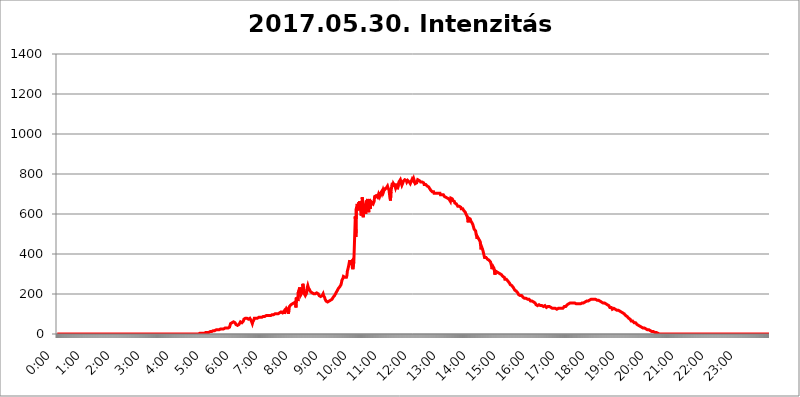
| Category | 2017.05.30. Intenzitás [W/m^2] |
|---|---|
| 0.0 | 0 |
| 0.0006944444444444445 | 0 |
| 0.001388888888888889 | 0 |
| 0.0020833333333333333 | 0 |
| 0.002777777777777778 | 0 |
| 0.003472222222222222 | 0 |
| 0.004166666666666667 | 0 |
| 0.004861111111111111 | 0 |
| 0.005555555555555556 | 0 |
| 0.0062499999999999995 | 0 |
| 0.006944444444444444 | 0 |
| 0.007638888888888889 | 0 |
| 0.008333333333333333 | 0 |
| 0.009027777777777779 | 0 |
| 0.009722222222222222 | 0 |
| 0.010416666666666666 | 0 |
| 0.011111111111111112 | 0 |
| 0.011805555555555555 | 0 |
| 0.012499999999999999 | 0 |
| 0.013194444444444444 | 0 |
| 0.013888888888888888 | 0 |
| 0.014583333333333332 | 0 |
| 0.015277777777777777 | 0 |
| 0.015972222222222224 | 0 |
| 0.016666666666666666 | 0 |
| 0.017361111111111112 | 0 |
| 0.018055555555555557 | 0 |
| 0.01875 | 0 |
| 0.019444444444444445 | 0 |
| 0.02013888888888889 | 0 |
| 0.020833333333333332 | 0 |
| 0.02152777777777778 | 0 |
| 0.022222222222222223 | 0 |
| 0.02291666666666667 | 0 |
| 0.02361111111111111 | 0 |
| 0.024305555555555556 | 0 |
| 0.024999999999999998 | 0 |
| 0.025694444444444447 | 0 |
| 0.02638888888888889 | 0 |
| 0.027083333333333334 | 0 |
| 0.027777777777777776 | 0 |
| 0.02847222222222222 | 0 |
| 0.029166666666666664 | 0 |
| 0.029861111111111113 | 0 |
| 0.030555555555555555 | 0 |
| 0.03125 | 0 |
| 0.03194444444444445 | 0 |
| 0.03263888888888889 | 0 |
| 0.03333333333333333 | 0 |
| 0.034027777777777775 | 0 |
| 0.034722222222222224 | 0 |
| 0.035416666666666666 | 0 |
| 0.036111111111111115 | 0 |
| 0.03680555555555556 | 0 |
| 0.0375 | 0 |
| 0.03819444444444444 | 0 |
| 0.03888888888888889 | 0 |
| 0.03958333333333333 | 0 |
| 0.04027777777777778 | 0 |
| 0.04097222222222222 | 0 |
| 0.041666666666666664 | 0 |
| 0.042361111111111106 | 0 |
| 0.04305555555555556 | 0 |
| 0.043750000000000004 | 0 |
| 0.044444444444444446 | 0 |
| 0.04513888888888889 | 0 |
| 0.04583333333333334 | 0 |
| 0.04652777777777778 | 0 |
| 0.04722222222222222 | 0 |
| 0.04791666666666666 | 0 |
| 0.04861111111111111 | 0 |
| 0.049305555555555554 | 0 |
| 0.049999999999999996 | 0 |
| 0.05069444444444445 | 0 |
| 0.051388888888888894 | 0 |
| 0.052083333333333336 | 0 |
| 0.05277777777777778 | 0 |
| 0.05347222222222222 | 0 |
| 0.05416666666666667 | 0 |
| 0.05486111111111111 | 0 |
| 0.05555555555555555 | 0 |
| 0.05625 | 0 |
| 0.05694444444444444 | 0 |
| 0.057638888888888885 | 0 |
| 0.05833333333333333 | 0 |
| 0.05902777777777778 | 0 |
| 0.059722222222222225 | 0 |
| 0.06041666666666667 | 0 |
| 0.061111111111111116 | 0 |
| 0.06180555555555556 | 0 |
| 0.0625 | 0 |
| 0.06319444444444444 | 0 |
| 0.06388888888888888 | 0 |
| 0.06458333333333334 | 0 |
| 0.06527777777777778 | 0 |
| 0.06597222222222222 | 0 |
| 0.06666666666666667 | 0 |
| 0.06736111111111111 | 0 |
| 0.06805555555555555 | 0 |
| 0.06874999999999999 | 0 |
| 0.06944444444444443 | 0 |
| 0.07013888888888889 | 0 |
| 0.07083333333333333 | 0 |
| 0.07152777777777779 | 0 |
| 0.07222222222222223 | 0 |
| 0.07291666666666667 | 0 |
| 0.07361111111111111 | 0 |
| 0.07430555555555556 | 0 |
| 0.075 | 0 |
| 0.07569444444444444 | 0 |
| 0.0763888888888889 | 0 |
| 0.07708333333333334 | 0 |
| 0.07777777777777778 | 0 |
| 0.07847222222222222 | 0 |
| 0.07916666666666666 | 0 |
| 0.0798611111111111 | 0 |
| 0.08055555555555556 | 0 |
| 0.08125 | 0 |
| 0.08194444444444444 | 0 |
| 0.08263888888888889 | 0 |
| 0.08333333333333333 | 0 |
| 0.08402777777777777 | 0 |
| 0.08472222222222221 | 0 |
| 0.08541666666666665 | 0 |
| 0.08611111111111112 | 0 |
| 0.08680555555555557 | 0 |
| 0.08750000000000001 | 0 |
| 0.08819444444444445 | 0 |
| 0.08888888888888889 | 0 |
| 0.08958333333333333 | 0 |
| 0.09027777777777778 | 0 |
| 0.09097222222222222 | 0 |
| 0.09166666666666667 | 0 |
| 0.09236111111111112 | 0 |
| 0.09305555555555556 | 0 |
| 0.09375 | 0 |
| 0.09444444444444444 | 0 |
| 0.09513888888888888 | 0 |
| 0.09583333333333333 | 0 |
| 0.09652777777777777 | 0 |
| 0.09722222222222222 | 0 |
| 0.09791666666666667 | 0 |
| 0.09861111111111111 | 0 |
| 0.09930555555555555 | 0 |
| 0.09999999999999999 | 0 |
| 0.10069444444444443 | 0 |
| 0.1013888888888889 | 0 |
| 0.10208333333333335 | 0 |
| 0.10277777777777779 | 0 |
| 0.10347222222222223 | 0 |
| 0.10416666666666667 | 0 |
| 0.10486111111111111 | 0 |
| 0.10555555555555556 | 0 |
| 0.10625 | 0 |
| 0.10694444444444444 | 0 |
| 0.1076388888888889 | 0 |
| 0.10833333333333334 | 0 |
| 0.10902777777777778 | 0 |
| 0.10972222222222222 | 0 |
| 0.1111111111111111 | 0 |
| 0.11180555555555556 | 0 |
| 0.11180555555555556 | 0 |
| 0.1125 | 0 |
| 0.11319444444444444 | 0 |
| 0.11388888888888889 | 0 |
| 0.11458333333333333 | 0 |
| 0.11527777777777777 | 0 |
| 0.11597222222222221 | 0 |
| 0.11666666666666665 | 0 |
| 0.1173611111111111 | 0 |
| 0.11805555555555557 | 0 |
| 0.11944444444444445 | 0 |
| 0.12013888888888889 | 0 |
| 0.12083333333333333 | 0 |
| 0.12152777777777778 | 0 |
| 0.12222222222222223 | 0 |
| 0.12291666666666667 | 0 |
| 0.12291666666666667 | 0 |
| 0.12361111111111112 | 0 |
| 0.12430555555555556 | 0 |
| 0.125 | 0 |
| 0.12569444444444444 | 0 |
| 0.12638888888888888 | 0 |
| 0.12708333333333333 | 0 |
| 0.16875 | 0 |
| 0.12847222222222224 | 0 |
| 0.12916666666666668 | 0 |
| 0.12986111111111112 | 0 |
| 0.13055555555555556 | 0 |
| 0.13125 | 0 |
| 0.13194444444444445 | 0 |
| 0.1326388888888889 | 0 |
| 0.13333333333333333 | 0 |
| 0.13402777777777777 | 0 |
| 0.13402777777777777 | 0 |
| 0.13472222222222222 | 0 |
| 0.13541666666666666 | 0 |
| 0.1361111111111111 | 0 |
| 0.13749999999999998 | 0 |
| 0.13819444444444443 | 0 |
| 0.1388888888888889 | 0 |
| 0.13958333333333334 | 0 |
| 0.14027777777777778 | 0 |
| 0.14097222222222222 | 0 |
| 0.14166666666666666 | 0 |
| 0.1423611111111111 | 0 |
| 0.14305555555555557 | 0 |
| 0.14375000000000002 | 0 |
| 0.14444444444444446 | 0 |
| 0.1451388888888889 | 0 |
| 0.1451388888888889 | 0 |
| 0.14652777777777778 | 0 |
| 0.14722222222222223 | 0 |
| 0.14791666666666667 | 0 |
| 0.1486111111111111 | 0 |
| 0.14930555555555555 | 0 |
| 0.15 | 0 |
| 0.15069444444444444 | 0 |
| 0.15138888888888888 | 0 |
| 0.15208333333333332 | 0 |
| 0.15277777777777776 | 0 |
| 0.15347222222222223 | 0 |
| 0.15416666666666667 | 0 |
| 0.15486111111111112 | 0 |
| 0.15555555555555556 | 0 |
| 0.15625 | 0 |
| 0.15694444444444444 | 0 |
| 0.15763888888888888 | 0 |
| 0.15833333333333333 | 0 |
| 0.15902777777777777 | 0 |
| 0.15972222222222224 | 0 |
| 0.16041666666666668 | 0 |
| 0.16111111111111112 | 0 |
| 0.16180555555555556 | 0 |
| 0.1625 | 0 |
| 0.16319444444444445 | 0 |
| 0.1638888888888889 | 0 |
| 0.16458333333333333 | 0 |
| 0.16527777777777777 | 0 |
| 0.16597222222222222 | 0 |
| 0.16666666666666666 | 0 |
| 0.1673611111111111 | 0 |
| 0.16805555555555554 | 0 |
| 0.16874999999999998 | 0 |
| 0.16944444444444443 | 0 |
| 0.17013888888888887 | 0 |
| 0.1708333333333333 | 0 |
| 0.17152777777777775 | 0 |
| 0.17222222222222225 | 0 |
| 0.1729166666666667 | 0 |
| 0.17361111111111113 | 0 |
| 0.17430555555555557 | 0 |
| 0.17500000000000002 | 0 |
| 0.17569444444444446 | 0 |
| 0.1763888888888889 | 0 |
| 0.17708333333333334 | 0 |
| 0.17777777777777778 | 0 |
| 0.17847222222222223 | 0 |
| 0.17916666666666667 | 0 |
| 0.1798611111111111 | 0 |
| 0.18055555555555555 | 0 |
| 0.18125 | 0 |
| 0.18194444444444444 | 0 |
| 0.1826388888888889 | 0 |
| 0.18333333333333335 | 0 |
| 0.1840277777777778 | 0 |
| 0.18472222222222223 | 0 |
| 0.18541666666666667 | 0 |
| 0.18611111111111112 | 0 |
| 0.18680555555555556 | 0 |
| 0.1875 | 0 |
| 0.18819444444444444 | 0 |
| 0.18888888888888888 | 0 |
| 0.18958333333333333 | 0 |
| 0.19027777777777777 | 0 |
| 0.1909722222222222 | 0 |
| 0.19166666666666665 | 0 |
| 0.19236111111111112 | 0 |
| 0.19305555555555554 | 0 |
| 0.19375 | 0 |
| 0.19444444444444445 | 0 |
| 0.1951388888888889 | 0 |
| 0.19583333333333333 | 0 |
| 0.19652777777777777 | 0 |
| 0.19722222222222222 | 0 |
| 0.19791666666666666 | 0 |
| 0.1986111111111111 | 0 |
| 0.19930555555555554 | 3.525 |
| 0.19999999999999998 | 3.525 |
| 0.20069444444444443 | 3.525 |
| 0.20138888888888887 | 3.525 |
| 0.2020833333333333 | 3.525 |
| 0.2027777777777778 | 3.525 |
| 0.2034722222222222 | 3.525 |
| 0.2041666666666667 | 3.525 |
| 0.20486111111111113 | 3.525 |
| 0.20555555555555557 | 3.525 |
| 0.20625000000000002 | 3.525 |
| 0.20694444444444446 | 3.525 |
| 0.2076388888888889 | 3.525 |
| 0.20833333333333334 | 7.887 |
| 0.20902777777777778 | 7.887 |
| 0.20972222222222223 | 7.887 |
| 0.21041666666666667 | 7.887 |
| 0.2111111111111111 | 7.887 |
| 0.21180555555555555 | 7.887 |
| 0.2125 | 7.887 |
| 0.21319444444444444 | 7.887 |
| 0.2138888888888889 | 12.257 |
| 0.21458333333333335 | 12.257 |
| 0.2152777777777778 | 12.257 |
| 0.21597222222222223 | 12.257 |
| 0.21666666666666667 | 12.257 |
| 0.21736111111111112 | 12.257 |
| 0.21805555555555556 | 12.257 |
| 0.21875 | 16.636 |
| 0.21944444444444444 | 16.636 |
| 0.22013888888888888 | 16.636 |
| 0.22083333333333333 | 16.636 |
| 0.22152777777777777 | 16.636 |
| 0.2222222222222222 | 16.636 |
| 0.22291666666666665 | 21.024 |
| 0.2236111111111111 | 21.024 |
| 0.22430555555555556 | 21.024 |
| 0.225 | 21.024 |
| 0.22569444444444445 | 21.024 |
| 0.2263888888888889 | 21.024 |
| 0.22708333333333333 | 21.024 |
| 0.22777777777777777 | 21.024 |
| 0.22847222222222222 | 25.419 |
| 0.22916666666666666 | 25.419 |
| 0.2298611111111111 | 25.419 |
| 0.23055555555555554 | 25.419 |
| 0.23124999999999998 | 25.419 |
| 0.23194444444444443 | 25.419 |
| 0.23263888888888887 | 25.419 |
| 0.2333333333333333 | 25.419 |
| 0.2340277777777778 | 25.419 |
| 0.2347222222222222 | 29.823 |
| 0.2354166666666667 | 29.823 |
| 0.23611111111111113 | 29.823 |
| 0.23680555555555557 | 29.823 |
| 0.23750000000000002 | 29.823 |
| 0.23819444444444446 | 29.823 |
| 0.2388888888888889 | 29.823 |
| 0.23958333333333334 | 29.823 |
| 0.24027777777777778 | 34.234 |
| 0.24097222222222223 | 34.234 |
| 0.24166666666666667 | 34.234 |
| 0.2423611111111111 | 38.653 |
| 0.24305555555555555 | 51.951 |
| 0.24375 | 51.951 |
| 0.24444444444444446 | 56.398 |
| 0.24513888888888888 | 56.398 |
| 0.24583333333333335 | 56.398 |
| 0.2465277777777778 | 60.85 |
| 0.24722222222222223 | 60.85 |
| 0.24791666666666667 | 60.85 |
| 0.24861111111111112 | 60.85 |
| 0.24930555555555556 | 56.398 |
| 0.25 | 56.398 |
| 0.25069444444444444 | 47.511 |
| 0.2513888888888889 | 43.079 |
| 0.2520833333333333 | 43.079 |
| 0.25277777777777777 | 43.079 |
| 0.2534722222222222 | 43.079 |
| 0.25416666666666665 | 47.511 |
| 0.2548611111111111 | 47.511 |
| 0.2555555555555556 | 47.511 |
| 0.25625000000000003 | 51.951 |
| 0.2569444444444445 | 60.85 |
| 0.2576388888888889 | 65.31 |
| 0.25833333333333336 | 65.31 |
| 0.2590277777777778 | 56.398 |
| 0.25972222222222224 | 60.85 |
| 0.2604166666666667 | 60.85 |
| 0.2611111111111111 | 65.31 |
| 0.26180555555555557 | 74.246 |
| 0.2625 | 78.722 |
| 0.26319444444444445 | 74.246 |
| 0.2638888888888889 | 78.722 |
| 0.26458333333333334 | 78.722 |
| 0.2652777777777778 | 78.722 |
| 0.2659722222222222 | 78.722 |
| 0.26666666666666666 | 78.722 |
| 0.2673611111111111 | 74.246 |
| 0.26805555555555555 | 74.246 |
| 0.26875 | 78.722 |
| 0.26944444444444443 | 78.722 |
| 0.2701388888888889 | 78.722 |
| 0.2708333333333333 | 78.722 |
| 0.27152777777777776 | 78.722 |
| 0.2722222222222222 | 65.31 |
| 0.27291666666666664 | 60.85 |
| 0.2736111111111111 | 51.951 |
| 0.2743055555555555 | 60.85 |
| 0.27499999999999997 | 60.85 |
| 0.27569444444444446 | 69.775 |
| 0.27638888888888885 | 78.722 |
| 0.27708333333333335 | 78.722 |
| 0.2777777777777778 | 78.722 |
| 0.27847222222222223 | 78.722 |
| 0.2791666666666667 | 78.722 |
| 0.2798611111111111 | 74.246 |
| 0.28055555555555556 | 78.722 |
| 0.28125 | 78.722 |
| 0.28194444444444444 | 83.205 |
| 0.2826388888888889 | 83.205 |
| 0.2833333333333333 | 83.205 |
| 0.28402777777777777 | 83.205 |
| 0.2847222222222222 | 83.205 |
| 0.28541666666666665 | 83.205 |
| 0.28611111111111115 | 83.205 |
| 0.28680555555555554 | 83.205 |
| 0.28750000000000003 | 83.205 |
| 0.2881944444444445 | 87.692 |
| 0.2888888888888889 | 87.692 |
| 0.28958333333333336 | 87.692 |
| 0.2902777777777778 | 87.692 |
| 0.29097222222222224 | 87.692 |
| 0.2916666666666667 | 87.692 |
| 0.2923611111111111 | 87.692 |
| 0.29305555555555557 | 92.184 |
| 0.29375 | 92.184 |
| 0.29444444444444445 | 92.184 |
| 0.2951388888888889 | 92.184 |
| 0.29583333333333334 | 92.184 |
| 0.2965277777777778 | 92.184 |
| 0.2972222222222222 | 92.184 |
| 0.29791666666666666 | 92.184 |
| 0.2986111111111111 | 92.184 |
| 0.29930555555555555 | 92.184 |
| 0.3 | 96.682 |
| 0.30069444444444443 | 96.682 |
| 0.3013888888888889 | 96.682 |
| 0.3020833333333333 | 96.682 |
| 0.30277777777777776 | 96.682 |
| 0.3034722222222222 | 96.682 |
| 0.30416666666666664 | 101.184 |
| 0.3048611111111111 | 101.184 |
| 0.3055555555555555 | 101.184 |
| 0.30624999999999997 | 101.184 |
| 0.3069444444444444 | 101.184 |
| 0.3076388888888889 | 101.184 |
| 0.30833333333333335 | 101.184 |
| 0.3090277777777778 | 101.184 |
| 0.30972222222222223 | 101.184 |
| 0.3104166666666667 | 105.69 |
| 0.3111111111111111 | 105.69 |
| 0.31180555555555556 | 105.69 |
| 0.3125 | 105.69 |
| 0.31319444444444444 | 105.69 |
| 0.3138888888888889 | 110.201 |
| 0.3145833333333333 | 110.201 |
| 0.31527777777777777 | 110.201 |
| 0.3159722222222222 | 105.69 |
| 0.31666666666666665 | 110.201 |
| 0.31736111111111115 | 110.201 |
| 0.31805555555555554 | 114.716 |
| 0.31875000000000003 | 101.184 |
| 0.3194444444444445 | 110.201 |
| 0.3201388888888889 | 114.716 |
| 0.32083333333333336 | 105.69 |
| 0.3215277777777778 | 128.284 |
| 0.32222222222222224 | 128.284 |
| 0.3229166666666667 | 128.284 |
| 0.3236111111111111 | 119.235 |
| 0.32430555555555557 | 101.184 |
| 0.325 | 128.284 |
| 0.32569444444444445 | 137.347 |
| 0.3263888888888889 | 137.347 |
| 0.32708333333333334 | 141.884 |
| 0.3277777777777778 | 146.423 |
| 0.3284722222222222 | 146.423 |
| 0.32916666666666666 | 150.964 |
| 0.3298611111111111 | 150.964 |
| 0.33055555555555555 | 155.509 |
| 0.33125 | 155.509 |
| 0.33194444444444443 | 155.509 |
| 0.3326388888888889 | 160.056 |
| 0.3333333333333333 | 160.056 |
| 0.3340277777777778 | 160.056 |
| 0.3347222222222222 | 132.814 |
| 0.3354166666666667 | 182.82 |
| 0.3361111111111111 | 182.82 |
| 0.3368055555555556 | 182.82 |
| 0.33749999999999997 | 164.605 |
| 0.33819444444444446 | 210.182 |
| 0.33888888888888885 | 219.309 |
| 0.33958333333333335 | 223.873 |
| 0.34027777777777773 | 233 |
| 0.34097222222222223 | 214.746 |
| 0.3416666666666666 | 196.497 |
| 0.3423611111111111 | 191.937 |
| 0.3430555555555555 | 196.497 |
| 0.34375 | 210.182 |
| 0.3444444444444445 | 251.251 |
| 0.3451388888888889 | 255.813 |
| 0.3458333333333334 | 219.309 |
| 0.34652777777777777 | 201.058 |
| 0.34722222222222227 | 196.497 |
| 0.34791666666666665 | 191.937 |
| 0.34861111111111115 | 196.497 |
| 0.34930555555555554 | 201.058 |
| 0.35000000000000003 | 210.182 |
| 0.3506944444444444 | 233 |
| 0.3513888888888889 | 242.127 |
| 0.3520833333333333 | 233 |
| 0.3527777777777778 | 228.436 |
| 0.3534722222222222 | 228.436 |
| 0.3541666666666667 | 219.309 |
| 0.3548611111111111 | 214.746 |
| 0.35555555555555557 | 210.182 |
| 0.35625 | 205.62 |
| 0.35694444444444445 | 205.62 |
| 0.3576388888888889 | 205.62 |
| 0.35833333333333334 | 205.62 |
| 0.3590277777777778 | 201.058 |
| 0.3597222222222222 | 201.058 |
| 0.36041666666666666 | 201.058 |
| 0.3611111111111111 | 201.058 |
| 0.36180555555555555 | 201.058 |
| 0.3625 | 201.058 |
| 0.36319444444444443 | 205.62 |
| 0.3638888888888889 | 205.62 |
| 0.3645833333333333 | 205.62 |
| 0.3652777777777778 | 205.62 |
| 0.3659722222222222 | 201.058 |
| 0.3666666666666667 | 196.497 |
| 0.3673611111111111 | 191.937 |
| 0.3680555555555556 | 191.937 |
| 0.36874999999999997 | 187.378 |
| 0.36944444444444446 | 187.378 |
| 0.37013888888888885 | 182.82 |
| 0.37083333333333335 | 187.378 |
| 0.37152777777777773 | 191.937 |
| 0.37222222222222223 | 196.497 |
| 0.3729166666666666 | 201.058 |
| 0.3736111111111111 | 191.937 |
| 0.3743055555555555 | 187.378 |
| 0.375 | 182.82 |
| 0.3756944444444445 | 173.709 |
| 0.3763888888888889 | 169.156 |
| 0.3770833333333334 | 164.605 |
| 0.37777777777777777 | 160.056 |
| 0.37847222222222227 | 160.056 |
| 0.37916666666666665 | 160.056 |
| 0.37986111111111115 | 160.056 |
| 0.38055555555555554 | 160.056 |
| 0.38125000000000003 | 164.605 |
| 0.3819444444444444 | 164.605 |
| 0.3826388888888889 | 164.605 |
| 0.3833333333333333 | 169.156 |
| 0.3840277777777778 | 169.156 |
| 0.3847222222222222 | 173.709 |
| 0.3854166666666667 | 173.709 |
| 0.3861111111111111 | 178.264 |
| 0.38680555555555557 | 182.82 |
| 0.3875 | 182.82 |
| 0.38819444444444445 | 187.378 |
| 0.3888888888888889 | 191.937 |
| 0.38958333333333334 | 196.497 |
| 0.3902777777777778 | 201.058 |
| 0.3909722222222222 | 201.058 |
| 0.39166666666666666 | 210.182 |
| 0.3923611111111111 | 210.182 |
| 0.39305555555555555 | 219.309 |
| 0.39375 | 223.873 |
| 0.39444444444444443 | 228.436 |
| 0.3951388888888889 | 233 |
| 0.3958333333333333 | 233 |
| 0.3965277777777778 | 237.564 |
| 0.3972222222222222 | 242.127 |
| 0.3979166666666667 | 246.689 |
| 0.3986111111111111 | 255.813 |
| 0.3993055555555556 | 269.49 |
| 0.39999999999999997 | 274.047 |
| 0.40069444444444446 | 278.603 |
| 0.40138888888888885 | 287.709 |
| 0.40208333333333335 | 287.709 |
| 0.40277777777777773 | 287.709 |
| 0.40347222222222223 | 283.156 |
| 0.4041666666666666 | 278.603 |
| 0.4048611111111111 | 278.603 |
| 0.4055555555555555 | 283.156 |
| 0.40625 | 292.259 |
| 0.4069444444444445 | 314.98 |
| 0.4076388888888889 | 324.052 |
| 0.4083333333333334 | 328.584 |
| 0.40902777777777777 | 346.682 |
| 0.40972222222222227 | 360.221 |
| 0.41041666666666665 | 369.23 |
| 0.41111111111111115 | 355.712 |
| 0.41180555555555554 | 360.221 |
| 0.41250000000000003 | 351.198 |
| 0.4131944444444444 | 364.728 |
| 0.4138888888888889 | 333.113 |
| 0.4145833333333333 | 324.052 |
| 0.4152777777777778 | 324.052 |
| 0.4159722222222222 | 360.221 |
| 0.4166666666666667 | 355.712 |
| 0.4173611111111111 | 364.728 |
| 0.41805555555555557 | 588.009 |
| 0.41875 | 484.735 |
| 0.41944444444444445 | 625.784 |
| 0.4201388888888889 | 638.256 |
| 0.42083333333333334 | 650.667 |
| 0.4215277777777778 | 625.784 |
| 0.4222222222222222 | 617.436 |
| 0.42291666666666666 | 658.909 |
| 0.4236111111111111 | 650.667 |
| 0.42430555555555555 | 663.019 |
| 0.425 | 638.256 |
| 0.42569444444444443 | 613.252 |
| 0.4263888888888889 | 592.233 |
| 0.4270833333333333 | 625.784 |
| 0.4277777777777778 | 683.473 |
| 0.4284722222222222 | 650.667 |
| 0.4291666666666667 | 583.779 |
| 0.4298611111111111 | 625.784 |
| 0.4305555555555556 | 638.256 |
| 0.43124999999999997 | 650.667 |
| 0.43194444444444446 | 617.436 |
| 0.43263888888888885 | 600.661 |
| 0.43333333333333335 | 667.123 |
| 0.43402777777777773 | 658.909 |
| 0.43472222222222223 | 658.909 |
| 0.4354166666666666 | 675.311 |
| 0.4361111111111111 | 646.537 |
| 0.4368055555555555 | 609.062 |
| 0.4375 | 675.311 |
| 0.4381944444444445 | 646.537 |
| 0.4388888888888889 | 625.784 |
| 0.4395833333333334 | 642.4 |
| 0.44027777777777777 | 642.4 |
| 0.44097222222222227 | 658.909 |
| 0.44166666666666665 | 663.019 |
| 0.44236111111111115 | 663.019 |
| 0.44305555555555554 | 650.667 |
| 0.44375000000000003 | 654.791 |
| 0.4444444444444444 | 663.019 |
| 0.4451388888888889 | 687.544 |
| 0.4458333333333333 | 691.608 |
| 0.4465277777777778 | 691.608 |
| 0.4472222222222222 | 691.608 |
| 0.4479166666666667 | 687.544 |
| 0.4486111111111111 | 695.666 |
| 0.44930555555555557 | 683.473 |
| 0.45 | 691.608 |
| 0.45069444444444445 | 699.717 |
| 0.4513888888888889 | 703.762 |
| 0.45208333333333334 | 687.544 |
| 0.4527777777777778 | 687.544 |
| 0.4534722222222222 | 703.762 |
| 0.45416666666666666 | 703.762 |
| 0.4548611111111111 | 711.832 |
| 0.45555555555555555 | 703.762 |
| 0.45625 | 707.8 |
| 0.45694444444444443 | 719.877 |
| 0.4576388888888889 | 711.832 |
| 0.4583333333333333 | 719.877 |
| 0.4590277777777778 | 731.896 |
| 0.4597222222222222 | 723.889 |
| 0.4604166666666667 | 719.877 |
| 0.4611111111111111 | 727.896 |
| 0.4618055555555556 | 731.896 |
| 0.46249999999999997 | 731.896 |
| 0.46319444444444446 | 739.877 |
| 0.46388888888888885 | 731.896 |
| 0.46458333333333335 | 727.896 |
| 0.46527777777777773 | 719.877 |
| 0.46597222222222223 | 723.889 |
| 0.4666666666666666 | 679.395 |
| 0.4673611111111111 | 667.123 |
| 0.4680555555555555 | 711.832 |
| 0.46875 | 727.896 |
| 0.4694444444444445 | 747.834 |
| 0.4701388888888889 | 755.766 |
| 0.4708333333333334 | 735.89 |
| 0.47152777777777777 | 751.803 |
| 0.47222222222222227 | 751.803 |
| 0.47291666666666665 | 747.834 |
| 0.47361111111111115 | 739.877 |
| 0.47430555555555554 | 731.896 |
| 0.47500000000000003 | 735.89 |
| 0.4756944444444444 | 751.803 |
| 0.4763888888888889 | 731.896 |
| 0.4770833333333333 | 723.889 |
| 0.4777777777777778 | 719.877 |
| 0.4784722222222222 | 747.834 |
| 0.4791666666666667 | 759.723 |
| 0.4798611111111111 | 759.723 |
| 0.48055555555555557 | 755.766 |
| 0.48125 | 771.559 |
| 0.48194444444444445 | 763.674 |
| 0.4826388888888889 | 751.803 |
| 0.48333333333333334 | 743.859 |
| 0.4840277777777778 | 743.859 |
| 0.4847222222222222 | 755.766 |
| 0.48541666666666666 | 763.674 |
| 0.4861111111111111 | 759.723 |
| 0.48680555555555555 | 767.62 |
| 0.4875 | 771.559 |
| 0.48819444444444443 | 767.62 |
| 0.4888888888888889 | 775.492 |
| 0.4895833333333333 | 767.62 |
| 0.4902777777777778 | 759.723 |
| 0.4909722222222222 | 759.723 |
| 0.4916666666666667 | 767.62 |
| 0.4923611111111111 | 763.674 |
| 0.4930555555555556 | 763.674 |
| 0.49374999999999997 | 759.723 |
| 0.49444444444444446 | 759.723 |
| 0.49513888888888885 | 751.803 |
| 0.49583333333333335 | 755.766 |
| 0.49652777777777773 | 763.674 |
| 0.49722222222222223 | 767.62 |
| 0.4979166666666666 | 775.492 |
| 0.4986111111111111 | 771.559 |
| 0.4993055555555555 | 767.62 |
| 0.5 | 775.492 |
| 0.5006944444444444 | 767.62 |
| 0.5013888888888889 | 763.674 |
| 0.5020833333333333 | 751.803 |
| 0.5027777777777778 | 755.766 |
| 0.5034722222222222 | 755.766 |
| 0.5041666666666667 | 755.766 |
| 0.5048611111111111 | 759.723 |
| 0.5055555555555555 | 771.559 |
| 0.50625 | 767.62 |
| 0.5069444444444444 | 767.62 |
| 0.5076388888888889 | 767.62 |
| 0.5083333333333333 | 767.62 |
| 0.5090277777777777 | 767.62 |
| 0.5097222222222222 | 759.723 |
| 0.5104166666666666 | 763.674 |
| 0.5111111111111112 | 755.766 |
| 0.5118055555555555 | 759.723 |
| 0.5125000000000001 | 759.723 |
| 0.5131944444444444 | 755.766 |
| 0.513888888888889 | 755.766 |
| 0.5145833333333333 | 747.834 |
| 0.5152777777777778 | 743.859 |
| 0.5159722222222222 | 751.803 |
| 0.5166666666666667 | 747.834 |
| 0.517361111111111 | 743.859 |
| 0.5180555555555556 | 743.859 |
| 0.5187499999999999 | 739.877 |
| 0.5194444444444445 | 735.89 |
| 0.5201388888888888 | 735.89 |
| 0.5208333333333334 | 735.89 |
| 0.5215277777777778 | 731.896 |
| 0.5222222222222223 | 727.896 |
| 0.5229166666666667 | 727.896 |
| 0.5236111111111111 | 719.877 |
| 0.5243055555555556 | 723.889 |
| 0.525 | 719.877 |
| 0.5256944444444445 | 711.832 |
| 0.5263888888888889 | 711.832 |
| 0.5270833333333333 | 711.832 |
| 0.5277777777777778 | 711.832 |
| 0.5284722222222222 | 703.762 |
| 0.5291666666666667 | 703.762 |
| 0.5298611111111111 | 703.762 |
| 0.5305555555555556 | 703.762 |
| 0.53125 | 703.762 |
| 0.5319444444444444 | 703.762 |
| 0.5326388888888889 | 703.762 |
| 0.5333333333333333 | 703.762 |
| 0.5340277777777778 | 699.717 |
| 0.5347222222222222 | 703.762 |
| 0.5354166666666667 | 703.762 |
| 0.5361111111111111 | 703.762 |
| 0.5368055555555555 | 703.762 |
| 0.5375 | 695.666 |
| 0.5381944444444444 | 699.717 |
| 0.5388888888888889 | 699.717 |
| 0.5395833333333333 | 695.666 |
| 0.5402777777777777 | 695.666 |
| 0.5409722222222222 | 695.666 |
| 0.5416666666666666 | 695.666 |
| 0.5423611111111112 | 691.608 |
| 0.5430555555555555 | 687.544 |
| 0.5437500000000001 | 687.544 |
| 0.5444444444444444 | 687.544 |
| 0.545138888888889 | 683.473 |
| 0.5458333333333333 | 683.473 |
| 0.5465277777777778 | 679.395 |
| 0.5472222222222222 | 679.395 |
| 0.5479166666666667 | 675.311 |
| 0.548611111111111 | 675.311 |
| 0.5493055555555556 | 675.311 |
| 0.5499999999999999 | 675.311 |
| 0.5506944444444445 | 675.311 |
| 0.5513888888888888 | 663.019 |
| 0.5520833333333334 | 679.395 |
| 0.5527777777777778 | 675.311 |
| 0.5534722222222223 | 675.311 |
| 0.5541666666666667 | 675.311 |
| 0.5548611111111111 | 667.123 |
| 0.5555555555555556 | 667.123 |
| 0.55625 | 663.019 |
| 0.5569444444444445 | 663.019 |
| 0.5576388888888889 | 654.791 |
| 0.5583333333333333 | 658.909 |
| 0.5590277777777778 | 658.909 |
| 0.5597222222222222 | 650.667 |
| 0.5604166666666667 | 650.667 |
| 0.5611111111111111 | 646.537 |
| 0.5618055555555556 | 638.256 |
| 0.5625 | 638.256 |
| 0.5631944444444444 | 642.4 |
| 0.5638888888888889 | 638.256 |
| 0.5645833333333333 | 638.256 |
| 0.5652777777777778 | 634.105 |
| 0.5659722222222222 | 634.105 |
| 0.5666666666666667 | 625.784 |
| 0.5673611111111111 | 629.948 |
| 0.5680555555555555 | 629.948 |
| 0.56875 | 625.784 |
| 0.5694444444444444 | 625.784 |
| 0.5701388888888889 | 617.436 |
| 0.5708333333333333 | 617.436 |
| 0.5715277777777777 | 613.252 |
| 0.5722222222222222 | 609.062 |
| 0.5729166666666666 | 604.864 |
| 0.5736111111111112 | 596.45 |
| 0.5743055555555555 | 592.233 |
| 0.5750000000000001 | 588.009 |
| 0.5756944444444444 | 583.779 |
| 0.576388888888889 | 558.261 |
| 0.5770833333333333 | 579.542 |
| 0.5777777777777778 | 579.542 |
| 0.5784722222222222 | 579.542 |
| 0.5791666666666667 | 575.299 |
| 0.579861111111111 | 566.793 |
| 0.5805555555555556 | 566.793 |
| 0.5812499999999999 | 558.261 |
| 0.5819444444444445 | 553.986 |
| 0.5826388888888888 | 549.704 |
| 0.5833333333333334 | 541.121 |
| 0.5840277777777778 | 541.121 |
| 0.5847222222222223 | 523.88 |
| 0.5854166666666667 | 528.2 |
| 0.5861111111111111 | 523.88 |
| 0.5868055555555556 | 515.223 |
| 0.5875 | 497.836 |
| 0.5881944444444445 | 489.108 |
| 0.5888888888888889 | 475.972 |
| 0.5895833333333333 | 484.735 |
| 0.5902777777777778 | 480.356 |
| 0.5909722222222222 | 475.972 |
| 0.5916666666666667 | 480.356 |
| 0.5923611111111111 | 471.582 |
| 0.5930555555555556 | 462.786 |
| 0.59375 | 458.38 |
| 0.5944444444444444 | 422.943 |
| 0.5951388888888889 | 436.27 |
| 0.5958333333333333 | 431.833 |
| 0.5965277777777778 | 422.943 |
| 0.5972222222222222 | 414.035 |
| 0.5979166666666667 | 414.035 |
| 0.5986111111111111 | 409.574 |
| 0.5993055555555555 | 382.715 |
| 0.6 | 387.202 |
| 0.6006944444444444 | 387.202 |
| 0.6013888888888889 | 382.715 |
| 0.6020833333333333 | 378.224 |
| 0.6027777777777777 | 378.224 |
| 0.6034722222222222 | 373.729 |
| 0.6041666666666666 | 373.729 |
| 0.6048611111111112 | 373.729 |
| 0.6055555555555555 | 369.23 |
| 0.6062500000000001 | 364.728 |
| 0.6069444444444444 | 364.728 |
| 0.607638888888889 | 360.221 |
| 0.6083333333333333 | 355.712 |
| 0.6090277777777778 | 342.162 |
| 0.6097222222222222 | 324.052 |
| 0.6104166666666667 | 324.052 |
| 0.611111111111111 | 337.639 |
| 0.6118055555555556 | 333.113 |
| 0.6124999999999999 | 328.584 |
| 0.6131944444444445 | 314.98 |
| 0.6138888888888888 | 296.808 |
| 0.6145833333333334 | 314.98 |
| 0.6152777777777778 | 314.98 |
| 0.6159722222222223 | 314.98 |
| 0.6166666666666667 | 310.44 |
| 0.6173611111111111 | 305.898 |
| 0.6180555555555556 | 310.44 |
| 0.61875 | 305.898 |
| 0.6194444444444445 | 305.898 |
| 0.6201388888888889 | 305.898 |
| 0.6208333333333333 | 301.354 |
| 0.6215277777777778 | 301.354 |
| 0.6222222222222222 | 301.354 |
| 0.6229166666666667 | 296.808 |
| 0.6236111111111111 | 292.259 |
| 0.6243055555555556 | 292.259 |
| 0.625 | 287.709 |
| 0.6256944444444444 | 287.709 |
| 0.6263888888888889 | 287.709 |
| 0.6270833333333333 | 283.156 |
| 0.6277777777777778 | 274.047 |
| 0.6284722222222222 | 278.603 |
| 0.6291666666666667 | 269.49 |
| 0.6298611111111111 | 274.047 |
| 0.6305555555555555 | 269.49 |
| 0.63125 | 269.49 |
| 0.6319444444444444 | 264.932 |
| 0.6326388888888889 | 260.373 |
| 0.6333333333333333 | 260.373 |
| 0.6340277777777777 | 255.813 |
| 0.6347222222222222 | 251.251 |
| 0.6354166666666666 | 246.689 |
| 0.6361111111111112 | 246.689 |
| 0.6368055555555555 | 246.689 |
| 0.6375000000000001 | 242.127 |
| 0.6381944444444444 | 242.127 |
| 0.638888888888889 | 242.127 |
| 0.6395833333333333 | 233 |
| 0.6402777777777778 | 228.436 |
| 0.6409722222222222 | 228.436 |
| 0.6416666666666667 | 219.309 |
| 0.642361111111111 | 219.309 |
| 0.6430555555555556 | 214.746 |
| 0.6437499999999999 | 214.746 |
| 0.6444444444444445 | 214.746 |
| 0.6451388888888888 | 210.182 |
| 0.6458333333333334 | 205.62 |
| 0.6465277777777778 | 205.62 |
| 0.6472222222222223 | 196.497 |
| 0.6479166666666667 | 196.497 |
| 0.6486111111111111 | 191.937 |
| 0.6493055555555556 | 191.937 |
| 0.65 | 187.378 |
| 0.6506944444444445 | 191.937 |
| 0.6513888888888889 | 191.937 |
| 0.6520833333333333 | 187.378 |
| 0.6527777777777778 | 187.378 |
| 0.6534722222222222 | 182.82 |
| 0.6541666666666667 | 182.82 |
| 0.6548611111111111 | 182.82 |
| 0.6555555555555556 | 178.264 |
| 0.65625 | 178.264 |
| 0.6569444444444444 | 178.264 |
| 0.6576388888888889 | 178.264 |
| 0.6583333333333333 | 173.709 |
| 0.6590277777777778 | 173.709 |
| 0.6597222222222222 | 173.709 |
| 0.6604166666666667 | 173.709 |
| 0.6611111111111111 | 169.156 |
| 0.6618055555555555 | 173.709 |
| 0.6625 | 169.156 |
| 0.6631944444444444 | 169.156 |
| 0.6638888888888889 | 164.605 |
| 0.6645833333333333 | 164.605 |
| 0.6652777777777777 | 164.605 |
| 0.6659722222222222 | 164.605 |
| 0.6666666666666666 | 160.056 |
| 0.6673611111111111 | 160.056 |
| 0.6680555555555556 | 160.056 |
| 0.6687500000000001 | 160.056 |
| 0.6694444444444444 | 160.056 |
| 0.6701388888888888 | 155.509 |
| 0.6708333333333334 | 150.964 |
| 0.6715277777777778 | 146.423 |
| 0.6722222222222222 | 141.884 |
| 0.6729166666666666 | 141.884 |
| 0.6736111111111112 | 141.884 |
| 0.6743055555555556 | 141.884 |
| 0.6749999999999999 | 146.423 |
| 0.6756944444444444 | 146.423 |
| 0.6763888888888889 | 141.884 |
| 0.6770833333333334 | 141.884 |
| 0.6777777777777777 | 141.884 |
| 0.6784722222222223 | 141.884 |
| 0.6791666666666667 | 137.347 |
| 0.6798611111111111 | 141.884 |
| 0.6805555555555555 | 141.884 |
| 0.68125 | 137.347 |
| 0.6819444444444445 | 137.347 |
| 0.6826388888888889 | 137.347 |
| 0.6833333333333332 | 137.347 |
| 0.6840277777777778 | 141.884 |
| 0.6847222222222222 | 137.347 |
| 0.6854166666666667 | 137.347 |
| 0.686111111111111 | 132.814 |
| 0.6868055555555556 | 132.814 |
| 0.6875 | 132.814 |
| 0.6881944444444444 | 137.347 |
| 0.688888888888889 | 132.814 |
| 0.6895833333333333 | 132.814 |
| 0.6902777777777778 | 137.347 |
| 0.6909722222222222 | 132.814 |
| 0.6916666666666668 | 132.814 |
| 0.6923611111111111 | 132.814 |
| 0.6930555555555555 | 132.814 |
| 0.69375 | 132.814 |
| 0.6944444444444445 | 128.284 |
| 0.6951388888888889 | 128.284 |
| 0.6958333333333333 | 128.284 |
| 0.6965277777777777 | 128.284 |
| 0.6972222222222223 | 128.284 |
| 0.6979166666666666 | 128.284 |
| 0.6986111111111111 | 128.284 |
| 0.6993055555555556 | 123.758 |
| 0.7000000000000001 | 128.284 |
| 0.7006944444444444 | 123.758 |
| 0.7013888888888888 | 128.284 |
| 0.7020833333333334 | 128.284 |
| 0.7027777777777778 | 128.284 |
| 0.7034722222222222 | 128.284 |
| 0.7041666666666666 | 123.758 |
| 0.7048611111111112 | 128.284 |
| 0.7055555555555556 | 123.758 |
| 0.7062499999999999 | 128.284 |
| 0.7069444444444444 | 128.284 |
| 0.7076388888888889 | 128.284 |
| 0.7083333333333334 | 128.284 |
| 0.7090277777777777 | 128.284 |
| 0.7097222222222223 | 132.814 |
| 0.7104166666666667 | 132.814 |
| 0.7111111111111111 | 137.347 |
| 0.7118055555555555 | 137.347 |
| 0.7125 | 137.347 |
| 0.7131944444444445 | 137.347 |
| 0.7138888888888889 | 141.884 |
| 0.7145833333333332 | 141.884 |
| 0.7152777777777778 | 146.423 |
| 0.7159722222222222 | 146.423 |
| 0.7166666666666667 | 146.423 |
| 0.717361111111111 | 150.964 |
| 0.7180555555555556 | 150.964 |
| 0.71875 | 150.964 |
| 0.7194444444444444 | 155.509 |
| 0.720138888888889 | 150.964 |
| 0.7208333333333333 | 155.509 |
| 0.7215277777777778 | 155.509 |
| 0.7222222222222222 | 155.509 |
| 0.7229166666666668 | 155.509 |
| 0.7236111111111111 | 155.509 |
| 0.7243055555555555 | 155.509 |
| 0.725 | 155.509 |
| 0.7256944444444445 | 155.509 |
| 0.7263888888888889 | 155.509 |
| 0.7270833333333333 | 155.509 |
| 0.7277777777777777 | 150.964 |
| 0.7284722222222223 | 150.964 |
| 0.7291666666666666 | 150.964 |
| 0.7298611111111111 | 150.964 |
| 0.7305555555555556 | 150.964 |
| 0.7312500000000001 | 150.964 |
| 0.7319444444444444 | 150.964 |
| 0.7326388888888888 | 150.964 |
| 0.7333333333333334 | 150.964 |
| 0.7340277777777778 | 150.964 |
| 0.7347222222222222 | 155.509 |
| 0.7354166666666666 | 155.509 |
| 0.7361111111111112 | 155.509 |
| 0.7368055555555556 | 155.509 |
| 0.7374999999999999 | 155.509 |
| 0.7381944444444444 | 155.509 |
| 0.7388888888888889 | 155.509 |
| 0.7395833333333334 | 155.509 |
| 0.7402777777777777 | 160.056 |
| 0.7409722222222223 | 160.056 |
| 0.7416666666666667 | 160.056 |
| 0.7423611111111111 | 164.605 |
| 0.7430555555555555 | 164.605 |
| 0.74375 | 164.605 |
| 0.7444444444444445 | 164.605 |
| 0.7451388888888889 | 164.605 |
| 0.7458333333333332 | 169.156 |
| 0.7465277777777778 | 169.156 |
| 0.7472222222222222 | 169.156 |
| 0.7479166666666667 | 173.709 |
| 0.748611111111111 | 173.709 |
| 0.7493055555555556 | 173.709 |
| 0.75 | 173.709 |
| 0.7506944444444444 | 173.709 |
| 0.751388888888889 | 173.709 |
| 0.7520833333333333 | 173.709 |
| 0.7527777777777778 | 173.709 |
| 0.7534722222222222 | 173.709 |
| 0.7541666666666668 | 173.709 |
| 0.7548611111111111 | 173.709 |
| 0.7555555555555555 | 173.709 |
| 0.75625 | 169.156 |
| 0.7569444444444445 | 169.156 |
| 0.7576388888888889 | 169.156 |
| 0.7583333333333333 | 169.156 |
| 0.7590277777777777 | 169.156 |
| 0.7597222222222223 | 164.605 |
| 0.7604166666666666 | 164.605 |
| 0.7611111111111111 | 164.605 |
| 0.7618055555555556 | 164.605 |
| 0.7625000000000001 | 160.056 |
| 0.7631944444444444 | 160.056 |
| 0.7638888888888888 | 160.056 |
| 0.7645833333333334 | 160.056 |
| 0.7652777777777778 | 155.509 |
| 0.7659722222222222 | 155.509 |
| 0.7666666666666666 | 155.509 |
| 0.7673611111111112 | 155.509 |
| 0.7680555555555556 | 155.509 |
| 0.7687499999999999 | 155.509 |
| 0.7694444444444444 | 150.964 |
| 0.7701388888888889 | 150.964 |
| 0.7708333333333334 | 150.964 |
| 0.7715277777777777 | 146.423 |
| 0.7722222222222223 | 146.423 |
| 0.7729166666666667 | 146.423 |
| 0.7736111111111111 | 141.884 |
| 0.7743055555555555 | 137.347 |
| 0.775 | 132.814 |
| 0.7756944444444445 | 128.284 |
| 0.7763888888888889 | 132.814 |
| 0.7770833333333332 | 132.814 |
| 0.7777777777777778 | 128.284 |
| 0.7784722222222222 | 123.758 |
| 0.7791666666666667 | 128.284 |
| 0.779861111111111 | 128.284 |
| 0.7805555555555556 | 128.284 |
| 0.78125 | 128.284 |
| 0.7819444444444444 | 128.284 |
| 0.782638888888889 | 123.758 |
| 0.7833333333333333 | 123.758 |
| 0.7840277777777778 | 119.235 |
| 0.7847222222222222 | 119.235 |
| 0.7854166666666668 | 119.235 |
| 0.7861111111111111 | 119.235 |
| 0.7868055555555555 | 119.235 |
| 0.7875 | 114.716 |
| 0.7881944444444445 | 114.716 |
| 0.7888888888888889 | 114.716 |
| 0.7895833333333333 | 110.201 |
| 0.7902777777777777 | 110.201 |
| 0.7909722222222223 | 110.201 |
| 0.7916666666666666 | 105.69 |
| 0.7923611111111111 | 105.69 |
| 0.7930555555555556 | 105.69 |
| 0.7937500000000001 | 101.184 |
| 0.7944444444444444 | 101.184 |
| 0.7951388888888888 | 101.184 |
| 0.7958333333333334 | 96.682 |
| 0.7965277777777778 | 96.682 |
| 0.7972222222222222 | 92.184 |
| 0.7979166666666666 | 92.184 |
| 0.7986111111111112 | 92.184 |
| 0.7993055555555556 | 87.692 |
| 0.7999999999999999 | 83.205 |
| 0.8006944444444444 | 83.205 |
| 0.8013888888888889 | 78.722 |
| 0.8020833333333334 | 78.722 |
| 0.8027777777777777 | 74.246 |
| 0.8034722222222223 | 74.246 |
| 0.8041666666666667 | 69.775 |
| 0.8048611111111111 | 65.31 |
| 0.8055555555555555 | 65.31 |
| 0.80625 | 65.31 |
| 0.8069444444444445 | 65.31 |
| 0.8076388888888889 | 60.85 |
| 0.8083333333333332 | 60.85 |
| 0.8090277777777778 | 56.398 |
| 0.8097222222222222 | 56.398 |
| 0.8104166666666667 | 56.398 |
| 0.811111111111111 | 56.398 |
| 0.8118055555555556 | 51.951 |
| 0.8125 | 51.951 |
| 0.8131944444444444 | 47.511 |
| 0.813888888888889 | 47.511 |
| 0.8145833333333333 | 47.511 |
| 0.8152777777777778 | 43.079 |
| 0.8159722222222222 | 43.079 |
| 0.8166666666666668 | 43.079 |
| 0.8173611111111111 | 38.653 |
| 0.8180555555555555 | 38.653 |
| 0.81875 | 38.653 |
| 0.8194444444444445 | 34.234 |
| 0.8201388888888889 | 34.234 |
| 0.8208333333333333 | 34.234 |
| 0.8215277777777777 | 29.823 |
| 0.8222222222222223 | 29.823 |
| 0.8229166666666666 | 29.823 |
| 0.8236111111111111 | 29.823 |
| 0.8243055555555556 | 25.419 |
| 0.8250000000000001 | 25.419 |
| 0.8256944444444444 | 25.419 |
| 0.8263888888888888 | 25.419 |
| 0.8270833333333334 | 25.419 |
| 0.8277777777777778 | 21.024 |
| 0.8284722222222222 | 21.024 |
| 0.8291666666666666 | 21.024 |
| 0.8298611111111112 | 21.024 |
| 0.8305555555555556 | 21.024 |
| 0.8312499999999999 | 16.636 |
| 0.8319444444444444 | 16.636 |
| 0.8326388888888889 | 16.636 |
| 0.8333333333333334 | 16.636 |
| 0.8340277777777777 | 12.257 |
| 0.8347222222222223 | 12.257 |
| 0.8354166666666667 | 12.257 |
| 0.8361111111111111 | 12.257 |
| 0.8368055555555555 | 12.257 |
| 0.8375 | 12.257 |
| 0.8381944444444445 | 7.887 |
| 0.8388888888888889 | 7.887 |
| 0.8395833333333332 | 7.887 |
| 0.8402777777777778 | 7.887 |
| 0.8409722222222222 | 3.525 |
| 0.8416666666666667 | 3.525 |
| 0.842361111111111 | 3.525 |
| 0.8430555555555556 | 3.525 |
| 0.84375 | 3.525 |
| 0.8444444444444444 | 0 |
| 0.845138888888889 | 0 |
| 0.8458333333333333 | 0 |
| 0.8465277777777778 | 0 |
| 0.8472222222222222 | 0 |
| 0.8479166666666668 | 0 |
| 0.8486111111111111 | 0 |
| 0.8493055555555555 | 0 |
| 0.85 | 0 |
| 0.8506944444444445 | 0 |
| 0.8513888888888889 | 0 |
| 0.8520833333333333 | 0 |
| 0.8527777777777777 | 0 |
| 0.8534722222222223 | 0 |
| 0.8541666666666666 | 0 |
| 0.8548611111111111 | 0 |
| 0.8555555555555556 | 0 |
| 0.8562500000000001 | 0 |
| 0.8569444444444444 | 0 |
| 0.8576388888888888 | 0 |
| 0.8583333333333334 | 0 |
| 0.8590277777777778 | 0 |
| 0.8597222222222222 | 0 |
| 0.8604166666666666 | 0 |
| 0.8611111111111112 | 0 |
| 0.8618055555555556 | 0 |
| 0.8624999999999999 | 0 |
| 0.8631944444444444 | 0 |
| 0.8638888888888889 | 0 |
| 0.8645833333333334 | 0 |
| 0.8652777777777777 | 0 |
| 0.8659722222222223 | 0 |
| 0.8666666666666667 | 0 |
| 0.8673611111111111 | 0 |
| 0.8680555555555555 | 0 |
| 0.86875 | 0 |
| 0.8694444444444445 | 0 |
| 0.8701388888888889 | 0 |
| 0.8708333333333332 | 0 |
| 0.8715277777777778 | 0 |
| 0.8722222222222222 | 0 |
| 0.8729166666666667 | 0 |
| 0.873611111111111 | 0 |
| 0.8743055555555556 | 0 |
| 0.875 | 0 |
| 0.8756944444444444 | 0 |
| 0.876388888888889 | 0 |
| 0.8770833333333333 | 0 |
| 0.8777777777777778 | 0 |
| 0.8784722222222222 | 0 |
| 0.8791666666666668 | 0 |
| 0.8798611111111111 | 0 |
| 0.8805555555555555 | 0 |
| 0.88125 | 0 |
| 0.8819444444444445 | 0 |
| 0.8826388888888889 | 0 |
| 0.8833333333333333 | 0 |
| 0.8840277777777777 | 0 |
| 0.8847222222222223 | 0 |
| 0.8854166666666666 | 0 |
| 0.8861111111111111 | 0 |
| 0.8868055555555556 | 0 |
| 0.8875000000000001 | 0 |
| 0.8881944444444444 | 0 |
| 0.8888888888888888 | 0 |
| 0.8895833333333334 | 0 |
| 0.8902777777777778 | 0 |
| 0.8909722222222222 | 0 |
| 0.8916666666666666 | 0 |
| 0.8923611111111112 | 0 |
| 0.8930555555555556 | 0 |
| 0.8937499999999999 | 0 |
| 0.8944444444444444 | 0 |
| 0.8951388888888889 | 0 |
| 0.8958333333333334 | 0 |
| 0.8965277777777777 | 0 |
| 0.8972222222222223 | 0 |
| 0.8979166666666667 | 0 |
| 0.8986111111111111 | 0 |
| 0.8993055555555555 | 0 |
| 0.9 | 0 |
| 0.9006944444444445 | 0 |
| 0.9013888888888889 | 0 |
| 0.9020833333333332 | 0 |
| 0.9027777777777778 | 0 |
| 0.9034722222222222 | 0 |
| 0.9041666666666667 | 0 |
| 0.904861111111111 | 0 |
| 0.9055555555555556 | 0 |
| 0.90625 | 0 |
| 0.9069444444444444 | 0 |
| 0.907638888888889 | 0 |
| 0.9083333333333333 | 0 |
| 0.9090277777777778 | 0 |
| 0.9097222222222222 | 0 |
| 0.9104166666666668 | 0 |
| 0.9111111111111111 | 0 |
| 0.9118055555555555 | 0 |
| 0.9125 | 0 |
| 0.9131944444444445 | 0 |
| 0.9138888888888889 | 0 |
| 0.9145833333333333 | 0 |
| 0.9152777777777777 | 0 |
| 0.9159722222222223 | 0 |
| 0.9166666666666666 | 0 |
| 0.9173611111111111 | 0 |
| 0.9180555555555556 | 0 |
| 0.9187500000000001 | 0 |
| 0.9194444444444444 | 0 |
| 0.9201388888888888 | 0 |
| 0.9208333333333334 | 0 |
| 0.9215277777777778 | 0 |
| 0.9222222222222222 | 0 |
| 0.9229166666666666 | 0 |
| 0.9236111111111112 | 0 |
| 0.9243055555555556 | 0 |
| 0.9249999999999999 | 0 |
| 0.9256944444444444 | 0 |
| 0.9263888888888889 | 0 |
| 0.9270833333333334 | 0 |
| 0.9277777777777777 | 0 |
| 0.9284722222222223 | 0 |
| 0.9291666666666667 | 0 |
| 0.9298611111111111 | 0 |
| 0.9305555555555555 | 0 |
| 0.93125 | 0 |
| 0.9319444444444445 | 0 |
| 0.9326388888888889 | 0 |
| 0.9333333333333332 | 0 |
| 0.9340277777777778 | 0 |
| 0.9347222222222222 | 0 |
| 0.9354166666666667 | 0 |
| 0.936111111111111 | 0 |
| 0.9368055555555556 | 0 |
| 0.9375 | 0 |
| 0.9381944444444444 | 0 |
| 0.938888888888889 | 0 |
| 0.9395833333333333 | 0 |
| 0.9402777777777778 | 0 |
| 0.9409722222222222 | 0 |
| 0.9416666666666668 | 0 |
| 0.9423611111111111 | 0 |
| 0.9430555555555555 | 0 |
| 0.94375 | 0 |
| 0.9444444444444445 | 0 |
| 0.9451388888888889 | 0 |
| 0.9458333333333333 | 0 |
| 0.9465277777777777 | 0 |
| 0.9472222222222223 | 0 |
| 0.9479166666666666 | 0 |
| 0.9486111111111111 | 0 |
| 0.9493055555555556 | 0 |
| 0.9500000000000001 | 0 |
| 0.9506944444444444 | 0 |
| 0.9513888888888888 | 0 |
| 0.9520833333333334 | 0 |
| 0.9527777777777778 | 0 |
| 0.9534722222222222 | 0 |
| 0.9541666666666666 | 0 |
| 0.9548611111111112 | 0 |
| 0.9555555555555556 | 0 |
| 0.9562499999999999 | 0 |
| 0.9569444444444444 | 0 |
| 0.9576388888888889 | 0 |
| 0.9583333333333334 | 0 |
| 0.9590277777777777 | 0 |
| 0.9597222222222223 | 0 |
| 0.9604166666666667 | 0 |
| 0.9611111111111111 | 0 |
| 0.9618055555555555 | 0 |
| 0.9625 | 0 |
| 0.9631944444444445 | 0 |
| 0.9638888888888889 | 0 |
| 0.9645833333333332 | 0 |
| 0.9652777777777778 | 0 |
| 0.9659722222222222 | 0 |
| 0.9666666666666667 | 0 |
| 0.967361111111111 | 0 |
| 0.9680555555555556 | 0 |
| 0.96875 | 0 |
| 0.9694444444444444 | 0 |
| 0.970138888888889 | 0 |
| 0.9708333333333333 | 0 |
| 0.9715277777777778 | 0 |
| 0.9722222222222222 | 0 |
| 0.9729166666666668 | 0 |
| 0.9736111111111111 | 0 |
| 0.9743055555555555 | 0 |
| 0.975 | 0 |
| 0.9756944444444445 | 0 |
| 0.9763888888888889 | 0 |
| 0.9770833333333333 | 0 |
| 0.9777777777777777 | 0 |
| 0.9784722222222223 | 0 |
| 0.9791666666666666 | 0 |
| 0.9798611111111111 | 0 |
| 0.9805555555555556 | 0 |
| 0.9812500000000001 | 0 |
| 0.9819444444444444 | 0 |
| 0.9826388888888888 | 0 |
| 0.9833333333333334 | 0 |
| 0.9840277777777778 | 0 |
| 0.9847222222222222 | 0 |
| 0.9854166666666666 | 0 |
| 0.9861111111111112 | 0 |
| 0.9868055555555556 | 0 |
| 0.9874999999999999 | 0 |
| 0.9881944444444444 | 0 |
| 0.9888888888888889 | 0 |
| 0.9895833333333334 | 0 |
| 0.9902777777777777 | 0 |
| 0.9909722222222223 | 0 |
| 0.9916666666666667 | 0 |
| 0.9923611111111111 | 0 |
| 0.9930555555555555 | 0 |
| 0.99375 | 0 |
| 0.9944444444444445 | 0 |
| 0.9951388888888889 | 0 |
| 0.9958333333333332 | 0 |
| 0.9965277777777778 | 0 |
| 0.9972222222222222 | 0 |
| 0.9979166666666667 | 0 |
| 0.998611111111111 | 0 |
| 0.9993055555555556 | 0 |